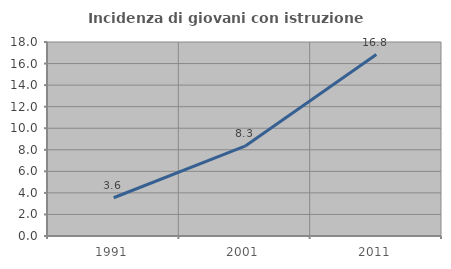
| Category | Incidenza di giovani con istruzione universitaria |
|---|---|
| 1991.0 | 3.55 |
| 2001.0 | 8.333 |
| 2011.0 | 16.837 |